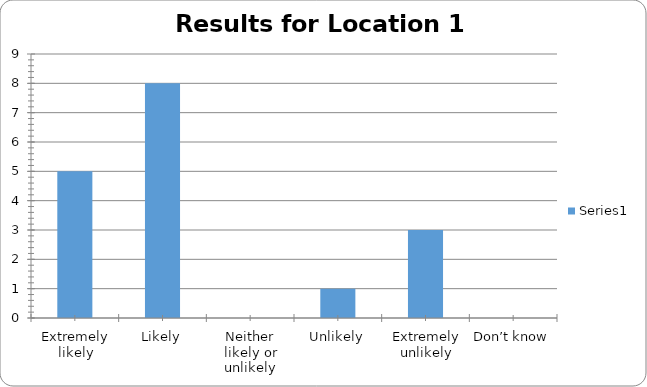
| Category | Series 0 |
|---|---|
| Extremely likely | 5 |
| Likely | 8 |
| Neither likely or unlikely | 0 |
| Unlikely | 1 |
| Extremely unlikely | 3 |
| Don’t know | 0 |